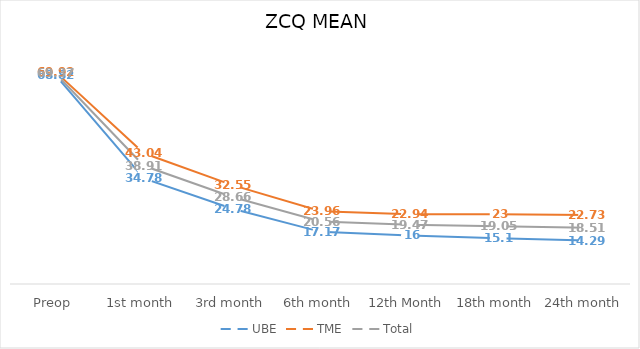
| Category | UBE | TME | Total |
|---|---|---|---|
| Preop | 68.82 | 69.92 | 69.37 |
| 1st month | 34.78 | 43.04 | 38.91 |
| 3rd month | 24.78 | 32.55 | 28.66 |
| 6th month | 17.17 | 23.96 | 20.56 |
| 12th Month | 16 | 22.94 | 19.47 |
| 18th month | 15.1 | 23 | 19.05 |
| 24th month | 14.29 | 22.73 | 18.51 |